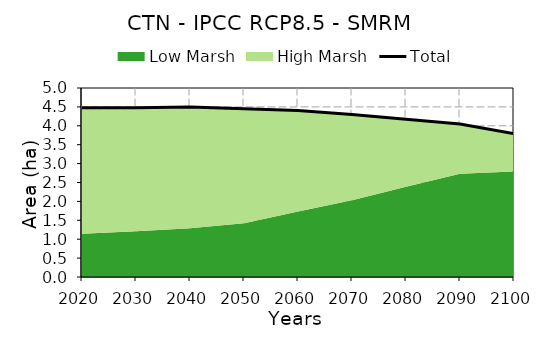
| Category | Total |
|---|---|
| 0 | 4.48 |
| 1 | 4.48 |
| 2 | 4.497 |
| 3 | 4.454 |
| 4 | 4.402 |
| 5 | 4.3 |
| 6 | 4.173 |
| 7 | 4.047 |
| 8 | 3.793 |